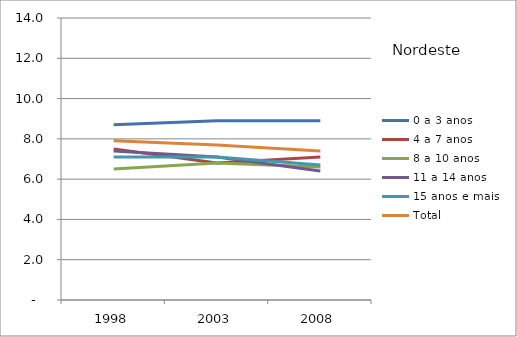
| Category | 0 a 3 anos | 4 a 7 anos | 8 a 10 anos | 11 a 14 anos | 15 anos e mais | Total |
|---|---|---|---|---|---|---|
| 1998.0 | 8.7 | 7.5 | 6.5 | 7.4 | 7.1 | 7.9 |
| 2003.0 | 8.9 | 6.8 | 6.8 | 7.1 | 7.1 | 7.7 |
| 2008.0 | 8.9 | 7.1 | 6.6 | 6.4 | 6.7 | 7.4 |